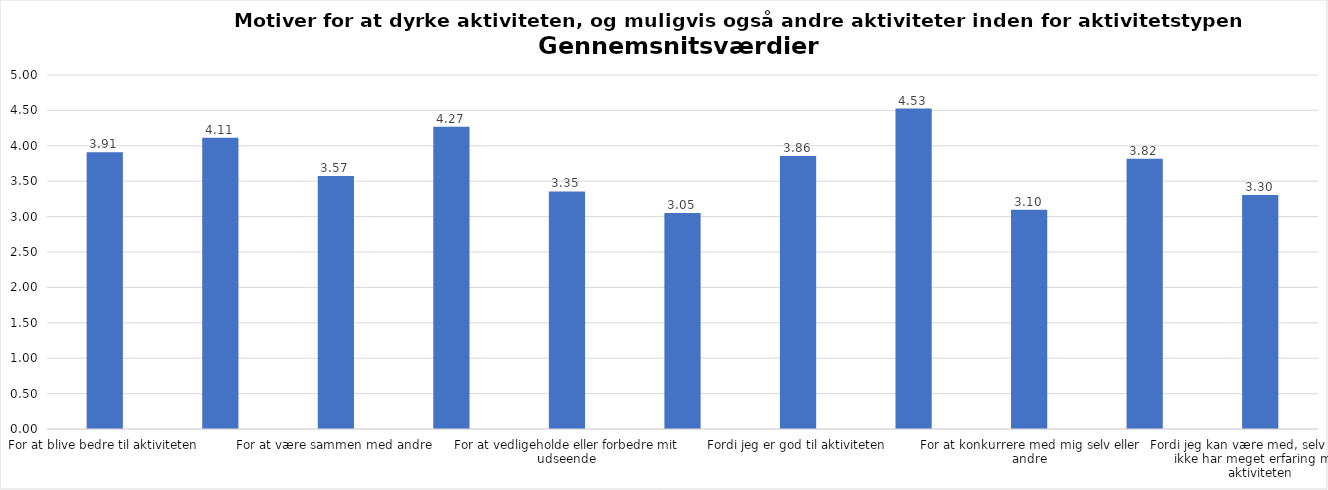
| Category | Gennemsnit |
|---|---|
| For at blive bedre til aktiviteten | 3.91 |
| For at vedligeholde eller forbedre min sundhed (fx helbred, fysisk form) | 4.113 |
| For at være sammen med andre | 3.574 |
| For at gøre noget godt for mig selv | 4.27 |
| For at vedligeholde eller forbedre mit udseende | 3.355 |
| Fordi andre i min omgangskreds opmuntrer mig til det | 3.052 |
| Fordi jeg er god til aktiviteten | 3.856 |
| Fordi jeg godt kan lide aktiviteten | 4.525 |
| For at konkurrere med mig selv eller andre | 3.096 |
| Fordi aktiviteten passer godt ind i min hverdag | 3.816 |
| Fordi jeg kan være med, selv om jeg ikke har meget erfaring med aktiviteten | 3.304 |